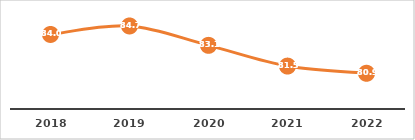
| Category | TITULACIÓN POR GENERACIÓN (%) |
|---|---|
| 2018.0 | 84.023 |
| 2019.0 | 84.709 |
| 2020.0 | 83.143 |
| 2021.0 | 81.468 |
| 2022.0 | 80.886 |